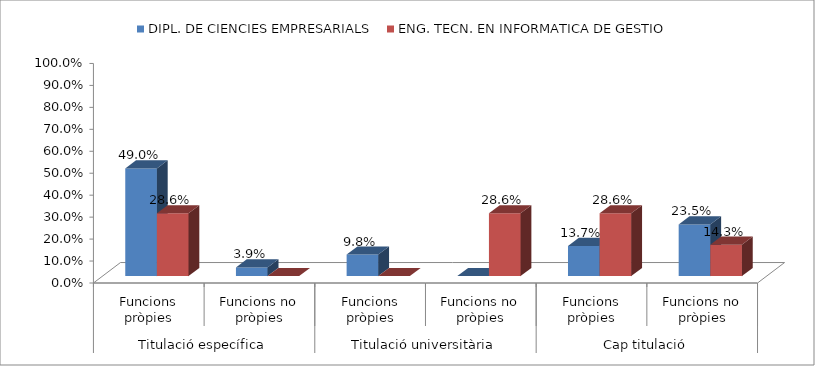
| Category | DIPL. DE CIENCIES EMPRESARIALS | ENG. TECN. EN INFORMATICA DE GESTIO |
|---|---|---|
| 0 | 0.49 | 0.286 |
| 1 | 0.039 | 0 |
| 2 | 0.098 | 0 |
| 3 | 0 | 0.286 |
| 4 | 0.137 | 0.286 |
| 5 | 0.235 | 0.143 |